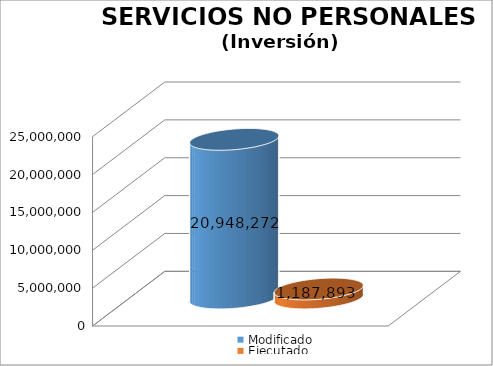
| Category | Modificado | Ejecutado |
|---|---|---|
| 0 | 20948272 | 1187892.99 |